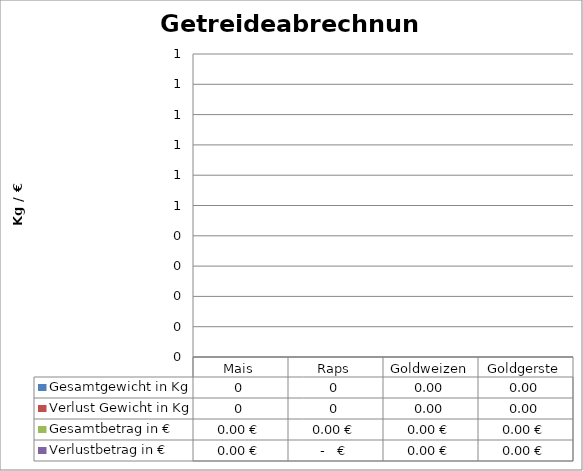
| Category | Gesamtgewicht in Kg | Verlust Gewicht in Kg | Gesamtbetrag in € | Verlustbetrag in € |
|---|---|---|---|---|
| Mais | 0 | 0 | 0 | 0 |
| Raps | 0 | 0 | 0 | 0 |
| Goldweizen | 0 | 0 | 0 | 0 |
| Goldgerste | 0 | 0 | 0 | 0 |